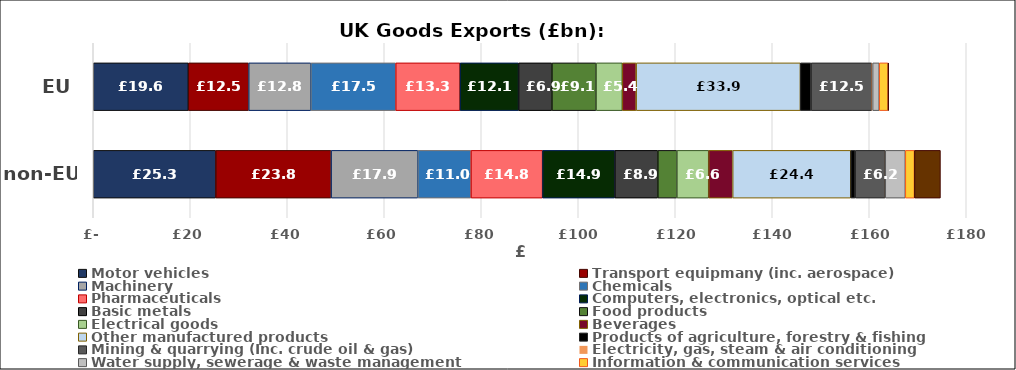
| Category | Motor vehicles | Transport equipmany (inc. aerospace) | Machinery | Chemicals | Pharmaceuticals | Computers, electronics, optical etc. | Basic metals | Food products | Electrical goods | Beverages | Other manufactured products | Products of agriculture, forestry & fishing | Mining & quarrying (Inc. crude oil & gas) | Electricity, gas, steam & air conditioning | Water supply, sewerage & waste management | Information & communication services | Arts, entertainment & recreation |
|---|---|---|---|---|---|---|---|---|---|---|---|---|---|---|---|---|---|
| EU | 19.6 | 12.45 | 12.82 | 17.5 | 13.26 | 12.07 | 6.87 | 9.11 | 5.41 | 2.85 | 33.86 | 2.199 | 12.52 | 0.175 | 1.365 | 1.82 | 0.141 |
| non-EU | 25.27 | 23.77 | 17.89 | 10.95 | 14.77 | 14.89 | 8.87 | 3.93 | 6.56 | 4.94 | 24.36 | 0.901 | 6.18 | 0.025 | 4.135 | 1.88 | 5.359 |